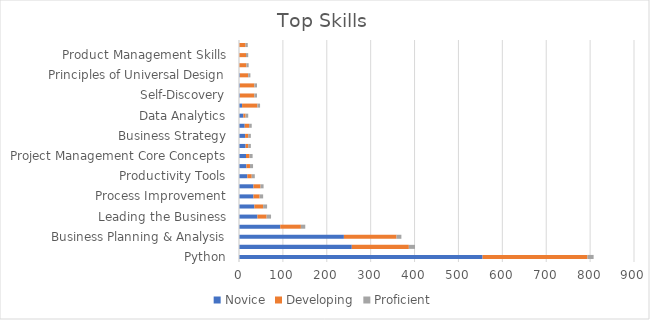
| Category | Novice | Developing | Proficient |
|---|---|---|---|
| Python | 555 | 239 | 14 |
| Leading Your Team | 257 | 130 | 14 |
| Business Planning & Analysis | 239 | 120 | 11 |
| Project Management Methods | 94 | 47 | 10 |
| Leading the Business | 42 | 21 | 10 |
| Collaboration | 35 | 20 | 9 |
| Process Improvement | 33 | 14 | 8 |
| Individual Professional Performance | 33 | 16 | 7 |
| Productivity Tools | 19 | 10 | 7 |
| Data Analyst to Data Scientist | 17 | 8 | 7 |
| Project Management Core Concepts | 16 | 8 | 7 |
| Business Communication | 15 | 6 | 6 |
| Business Strategy | 14 | 7 | 6 |
| Personal Productivity | 13 | 10 | 6 |
| Data Analytics | 10 | 5 | 6 |
| Leading Yourself | 7 | 35 | 6 |
| Self-Discovery | 2 | 33 | 6 |
| Finance | 2 | 33 | 6 |
| Principles of Universal Design | 2 | 19 | 5 |
| Human Resources | 0 | 17 | 5 |
| Product Management Skills | 0 | 16 | 5 |
| Cloud Basics | 0 | 15 | 5 |